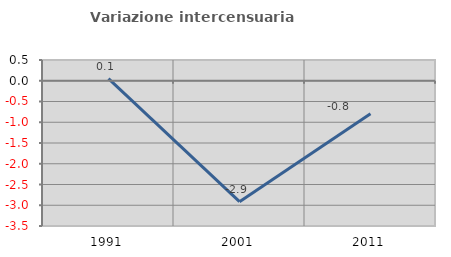
| Category | Variazione intercensuaria annua |
|---|---|
| 1991.0 | 0.053 |
| 2001.0 | -2.914 |
| 2011.0 | -0.793 |